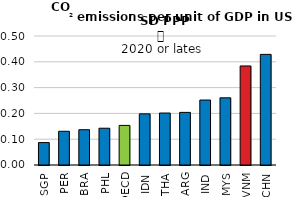
| Category | 2020 or latest available |
|---|---|
| SGP | 0.087 |
| PER | 0.131 |
| BRA | 0.137 |
| PHL | 0.143 |
| OECD | 0.153 |
| IDN | 0.198 |
| THA | 0.201 |
| ARG | 0.204 |
| IND | 0.252 |
| MYS | 0.26 |
| VNM | 0.384 |
| CHN | 0.429 |